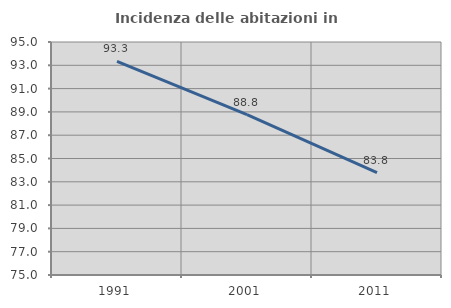
| Category | Incidenza delle abitazioni in proprietà  |
|---|---|
| 1991.0 | 93.333 |
| 2001.0 | 88.759 |
| 2011.0 | 83.784 |